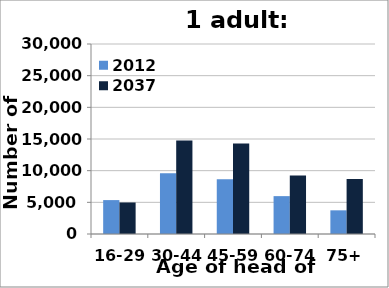
| Category | 2012 | 2037 |
|---|---|---|
| 16-29 | 5353 | 4975 |
| 30-44 | 9593 | 14756 |
| 45-59 | 8642 | 14307 |
| 60-74 | 5980 | 9227 |
| 75+ | 3737 | 8686 |